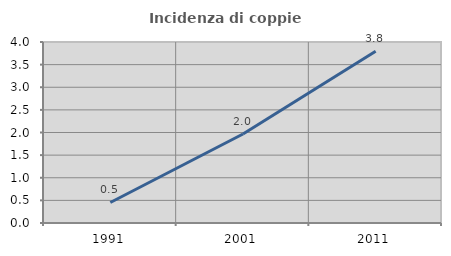
| Category | Incidenza di coppie miste |
|---|---|
| 1991.0 | 0.454 |
| 2001.0 | 1.967 |
| 2011.0 | 3.794 |